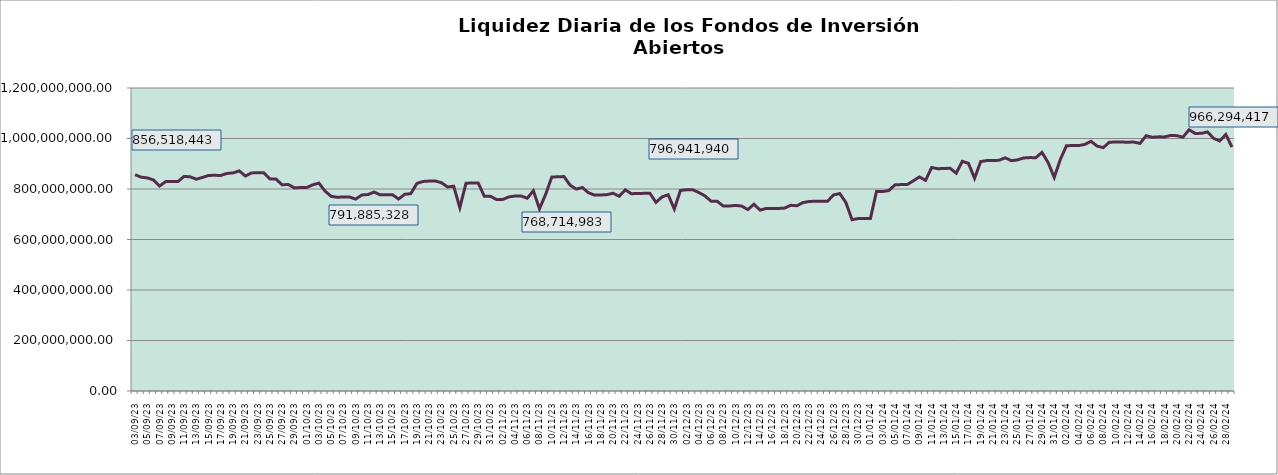
| Category | Series 0 |
|---|---|
| 2023-09-03 | 856518443.03 |
| 2023-09-04 | 846800888.01 |
| 2023-09-05 | 843799303.73 |
| 2023-09-06 | 836064243.98 |
| 2023-09-07 | 811835895.2 |
| 2023-09-08 | 829200588.03 |
| 2023-09-09 | 829710703.66 |
| 2023-09-10 | 829589151.05 |
| 2023-09-11 | 849892786.18 |
| 2023-09-12 | 848258732.7 |
| 2023-09-13 | 838817623.5 |
| 2023-09-14 | 845684000.27 |
| 2023-09-15 | 853912064.49 |
| 2023-09-16 | 854003181.36 |
| 2023-09-17 | 853882893.87 |
| 2023-09-18 | 861587443.4 |
| 2023-09-19 | 863825271.92 |
| 2023-09-20 | 871739708.28 |
| 2023-09-21 | 851274397.87 |
| 2023-09-22 | 863690740.26 |
| 2023-09-23 | 864423462.74 |
| 2023-09-24 | 864495939.38 |
| 2023-09-25 | 840094915.65 |
| 2023-09-26 | 839493871.47 |
| 2023-09-27 | 816397016.16 |
| 2023-09-28 | 818057445.14 |
| 2023-09-29 | 804357452.04 |
| 2023-09-30 | 805987241.89 |
| 2023-10-01 | 805861177.96 |
| 2023-10-02 | 816400848.97 |
| 2023-10-03 | 823292924.62 |
| 2023-10-04 | 791885328.33 |
| 2023-10-05 | 770805388.24 |
| 2023-10-06 | 767335904.7 |
| 2023-10-07 | 768415448.37 |
| 2023-10-08 | 768284658.47 |
| 2023-10-09 | 759931172.94 |
| 2023-10-10 | 776307966.06 |
| 2023-10-11 | 777978215.8 |
| 2023-10-12 | 787829367.49 |
| 2023-10-13 | 776843829.35 |
| 2023-10-14 | 776920366.75 |
| 2023-10-15 | 777520156.16 |
| 2023-10-16 | 760311511.08 |
| 2023-10-17 | 778972902.37 |
| 2023-10-18 | 781669931.69 |
| 2023-10-19 | 822356076.87 |
| 2023-10-20 | 829958566.75 |
| 2023-10-21 | 831436078.01 |
| 2023-10-22 | 831858452.66 |
| 2023-10-23 | 824908511.09 |
| 2023-10-24 | 808109378.63 |
| 2023-10-25 | 810985013.22 |
| 2023-10-26 | 726083306.33 |
| 2023-10-27 | 822647422.52 |
| 2023-10-28 | 824001909.86 |
| 2023-10-29 | 823876506.61 |
| 2023-10-30 | 770919488.28 |
| 2023-10-31 | 771130577.98 |
| 2023-11-01 | 758264332.87 |
| 2023-11-02 | 758373803.82 |
| 2023-11-03 | 768714983.43 |
| 2023-11-04 | 772179484.49 |
| 2023-11-05 | 772323569.13 |
| 2023-11-06 | 763367951.57 |
| 2023-11-07 | 792983502.5 |
| 2023-11-08 | 721638313.77 |
| 2023-11-09 | 778664606.79 |
| 2023-11-10 | 847133613.42 |
| 2023-11-11 | 848551214.1 |
| 2023-11-12 | 849139213.45 |
| 2023-11-13 | 815078203.41 |
| 2023-11-14 | 799630243.1 |
| 2023-11-15 | 805792345.1 |
| 2023-11-16 | 785029389.34 |
| 2023-11-17 | 775716450.94 |
| 2023-11-18 | 776309591.81 |
| 2023-11-19 | 777555671.55 |
| 2023-11-20 | 783102557.43 |
| 2023-11-21 | 771135511.34 |
| 2023-11-22 | 796718313.71 |
| 2023-11-23 | 781344537.67 |
| 2023-11-24 | 782266750.8 |
| 2023-11-25 | 782726600.14 |
| 2023-11-26 | 783455376.83 |
| 2023-11-27 | 747065225.8 |
| 2023-11-28 | 768489871.93 |
| 2023-11-29 | 777269842.82 |
| 2023-11-30 | 720652886.48 |
| 2023-12-01 | 794413077.37 |
| 2023-12-02 | 796941939.55 |
| 2023-12-03 | 797061690.61 |
| 2023-12-04 | 786052940.1 |
| 2023-12-05 | 772705894.99 |
| 2023-12-06 | 751866529.5 |
| 2023-12-07 | 751273612.08 |
| 2023-12-08 | 732200587.07 |
| 2023-12-09 | 732618765.02 |
| 2023-12-10 | 734977990.92 |
| 2023-12-11 | 732335473.7 |
| 2023-12-12 | 718631426.81 |
| 2023-12-13 | 739636751.02 |
| 2023-12-14 | 716352995.32 |
| 2023-12-15 | 723057477.07 |
| 2023-12-16 | 722889458.85 |
| 2023-12-17 | 722984908.96 |
| 2023-12-18 | 724345793.57 |
| 2023-12-19 | 735446579.01 |
| 2023-12-20 | 733743517.41 |
| 2023-12-21 | 746283219.33 |
| 2023-12-22 | 750445223.45 |
| 2023-12-23 | 751642183.57 |
| 2023-12-24 | 751513402.91 |
| 2023-12-25 | 751628523.3 |
| 2023-12-26 | 776674715.25 |
| 2023-12-27 | 781963225.03 |
| 2023-12-28 | 746551489.31 |
| 2023-12-29 | 678387935.77 |
| 2023-12-30 | 682929910.02 |
| 2023-12-31 | 682916992.01 |
| 2024-01-01 | 682779412.04 |
| 2024-01-02 | 790505203.1 |
| 2024-01-03 | 790146282.02 |
| 2024-01-04 | 793823002.4 |
| 2024-01-05 | 816293106.46 |
| 2024-01-06 | 817545565.7 |
| 2024-01-07 | 817410815.2 |
| 2024-01-08 | 832303234.16 |
| 2024-01-09 | 847828584.52 |
| 2024-01-10 | 834235111.24 |
| 2024-01-11 | 885197757.4 |
| 2024-01-12 | 880436363.23 |
| 2024-01-13 | 881088674.97 |
| 2024-01-14 | 882419770.78 |
| 2024-01-15 | 862608396.76 |
| 2024-01-16 | 909800403.34 |
| 2024-01-17 | 901660841.54 |
| 2024-01-18 | 842412437.33 |
| 2024-01-19 | 908681686.2 |
| 2024-01-20 | 912552752.95 |
| 2024-01-21 | 912413805.05 |
| 2024-01-22 | 913716175.24 |
| 2024-01-23 | 923615500.08 |
| 2024-01-24 | 912143416.06 |
| 2024-01-25 | 915328383.79 |
| 2024-01-26 | 922852474 |
| 2024-01-27 | 924296547.31 |
| 2024-01-28 | 924158784.48 |
| 2024-01-29 | 944947536.03 |
| 2024-01-30 | 905003413.81 |
| 2024-01-31 | 845906928.35 |
| 2024-02-01 | 917172174.73 |
| 2024-02-02 | 971475152.46 |
| 2024-02-03 | 972020419.78 |
| 2024-02-04 | 971879846.39 |
| 2024-02-05 | 976731599.22 |
| 2024-02-06 | 989060992.26 |
| 2024-02-07 | 969769288.86 |
| 2024-02-08 | 963777899.22 |
| 2024-02-09 | 985430864.48 |
| 2024-02-10 | 985849548.74 |
| 2024-02-11 | 985700574.74 |
| 2024-02-12 | 985553246.9 |
| 2024-02-13 | 985727209.06 |
| 2024-02-14 | 980640030.33 |
| 2024-02-15 | 1010984193.9 |
| 2024-02-16 | 1004886613.54 |
| 2024-02-17 | 1006509706.11 |
| 2024-02-18 | 1006363943.51 |
| 2024-02-19 | 1012334486.67 |
| 2024-02-20 | 1011150341.63 |
| 2024-02-21 | 1005270182.68 |
| 2024-02-22 | 1034545631.25 |
| 2024-02-23 | 1020165637.38 |
| 2024-02-24 | 1020359251.53 |
| 2024-02-25 | 1025990247.55 |
| 2024-02-26 | 1001009429.43 |
| 2024-02-27 | 990309173.23 |
| 2024-02-28 | 1015971759 |
| 2024-02-29 | 966294416.69 |